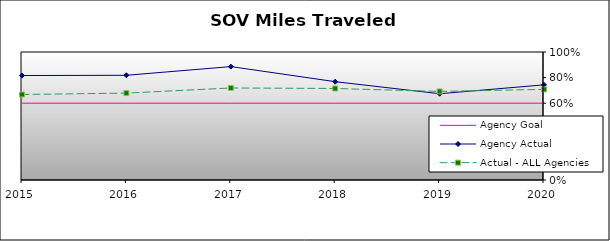
| Category | Agency Goal | Agency Actual | Actual - ALL Agencies |
|---|---|---|---|
| 2015.0 | 0.6 | 0.816 | 0.668 |
| 2016.0 | 0.6 | 0.818 | 0.679 |
| 2017.0 | 0.6 | 0.886 | 0.719 |
| 2018.0 | 0.6 | 0.768 | 0.715 |
| 2019.0 | 0.6 | 0.674 | 0.692 |
| 2020.0 | 0.6 | 0.743 | 0.708 |